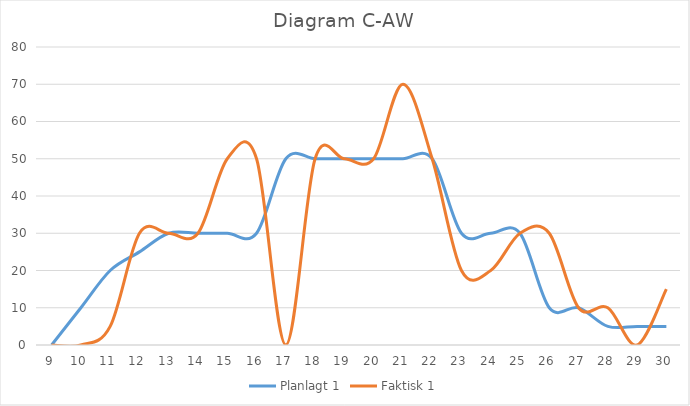
| Category | Planlagt 1 | Faktisk 1 |
|---|---|---|
| 9 | 0 | 0 |
| 10 | 10 | 0 |
| 11 | 20 | 5 |
| 12 | 25 | 30 |
| 13 | 30 | 30 |
| 14 | 30 | 30 |
| 15 | 30 | 50 |
| 16 | 30 | 50 |
| 17 | 50 | 0 |
| 18 | 50 | 50 |
| 19 | 50 | 50 |
| 20 | 50 | 50 |
| 21 | 50 | 70 |
| 22 | 50 | 50 |
| 23 | 30 | 20 |
| 24 | 30 | 20 |
| 25 | 30 | 30 |
| 26 | 10 | 30 |
| 27 | 10 | 10 |
| 28 | 5 | 10 |
| 29 | 5 | 0 |
| 30 | 5 | 15 |